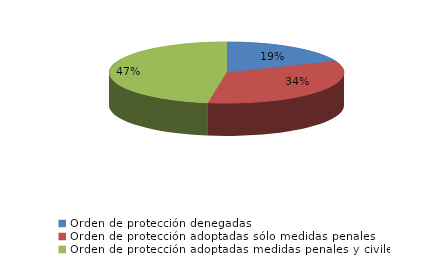
| Category | Series 0 |
|---|---|
| Orden de protección denegadas | 67 |
| Orden de protección adoptadas sólo medidas penales | 120 |
| Orden de protección adoptadas medidas penales y civiles | 169 |